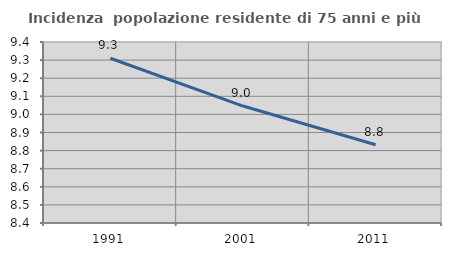
| Category | Incidenza  popolazione residente di 75 anni e più |
|---|---|
| 1991.0 | 9.31 |
| 2001.0 | 9.046 |
| 2011.0 | 8.832 |